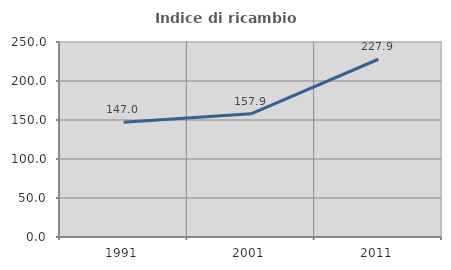
| Category | Indice di ricambio occupazionale  |
|---|---|
| 1991.0 | 146.97 |
| 2001.0 | 157.895 |
| 2011.0 | 227.885 |